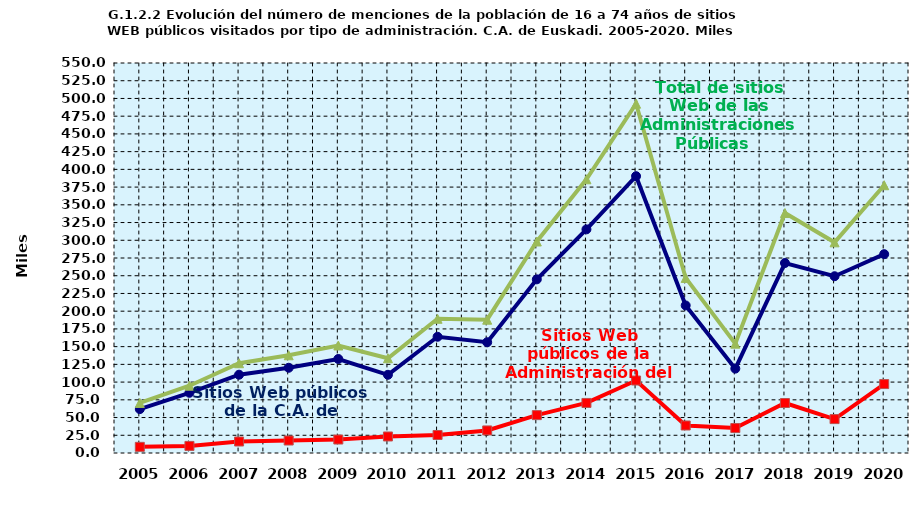
| Category | Sitios Web públicos de la C.A. de Euskadi | Sitios Web públicos de la Administración del Estado | Total de sitios Web de las Administraciones Públicas |
|---|---|---|---|
| 2005.0 | 61.9 | 8.7 | 70.6 |
| 2006.0 | 84.9 | 10 | 94.9 |
| 2007.0 | 110.4 | 16.2 | 126.6 |
| 2008.0 | 120.2 | 17.6 | 137.8 |
| 2009.0 | 132.6 | 19 | 151.6 |
| 2010.0 | 110.3 | 23.3 | 133.6 |
| 2011.0 | 163.9 | 25.4 | 189.3 |
| 2012.0 | 156.2 | 31.8 | 188 |
| 2013.0 | 244.9 | 53.4 | 298.3 |
| 2014.0 | 315.4 | 70.6 | 386 |
| 2015.0 | 390.4 | 102.2 | 492.6 |
| 2016.0 | 208.1 | 38.8 | 246.9 |
| 2017.0 | 119 | 35.2 | 154.2 |
| 2018.0 | 267.9 | 70.5 | 338.4 |
| 2019.0 | 249.3 | 47.8 | 297.1 |
| 2020.0 | 280.4 | 97.2 | 377.6 |